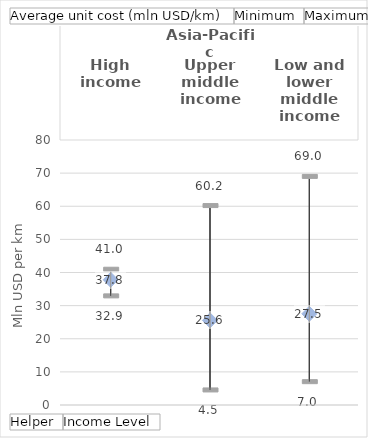
| Category | Average unit cost (mln USD/km) | Minimum | Maximum |
|---|---|---|---|
| 0 | 37.815 | 32.941 | 40.99 |
| 1 | 25.558 | 4.544 | 60.206 |
| 2 | 27.539 | 7.043 | 69.005 |